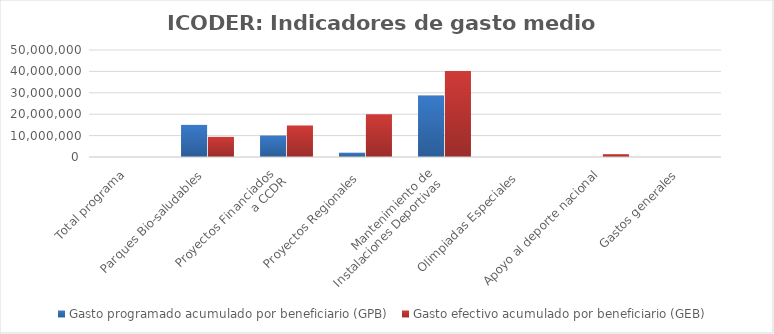
| Category | Gasto programado acumulado por beneficiario (GPB)  | Gasto efectivo acumulado por beneficiario (GEB)  |
|---|---|---|
| Total programa | 0 | 0 |
| Parques Bio-saludables | 15000000 | 9396206.25 |
| Proyectos Financiados 
a CCDR | 10000000 | 14735121.178 |
| Proyectos Regionales  | 2000000 | 20000000 |
| Mantenimiento de 
Instalaciones Deportivas  | 28729581.189 | 40226522.747 |
| Olimpiadas Especiales  | 0 | 0 |
| Apoyo al deporte nacional | 0 | 1321528.455 |
| Gastos generales | 0 | 0 |